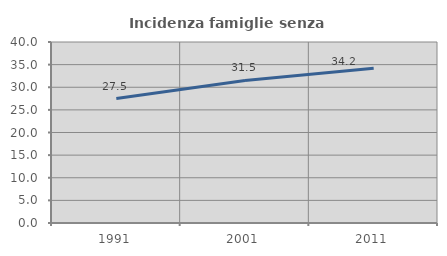
| Category | Incidenza famiglie senza nuclei |
|---|---|
| 1991.0 | 27.493 |
| 2001.0 | 31.492 |
| 2011.0 | 34.192 |